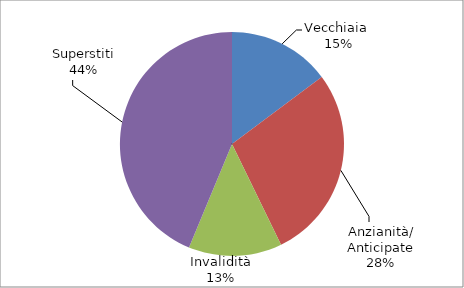
| Category | Series 0 |
|---|---|
| Vecchiaia  | 38877 |
| Anzianità/ Anticipate | 73663 |
| Invalidità | 35465 |
| Superstiti | 114996 |